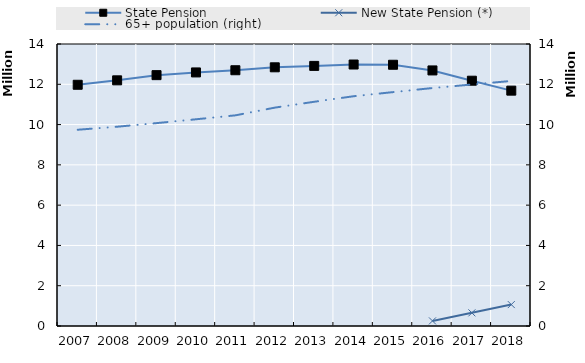
| Category | State Pension | New State Pension (*) |
|---|---|---|
| 2007.0 | 11976030 | 0 |
| 2008.0 | 12196440 | 0 |
| 2009.0 | 12453990 | 0 |
| 2010.0 | 12588750 | 0 |
| 2011.0 | 12697310 | 0 |
| 2012.0 | 12842820 | 0 |
| 2013.0 | 12913000 | 0 |
| 2014.0 | 12981350 | 0 |
| 2015.0 | 12969850 | 0 |
| 2016.0 | 12687572 | 252490 |
| 2017.0 | 12177332 | 653053 |
| 2018.0 | 11684170 | 1063093 |